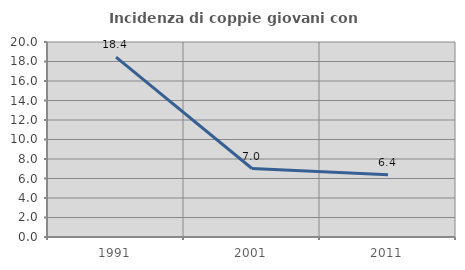
| Category | Incidenza di coppie giovani con figli |
|---|---|
| 1991.0 | 18.441 |
| 2001.0 | 7.024 |
| 2011.0 | 6.39 |